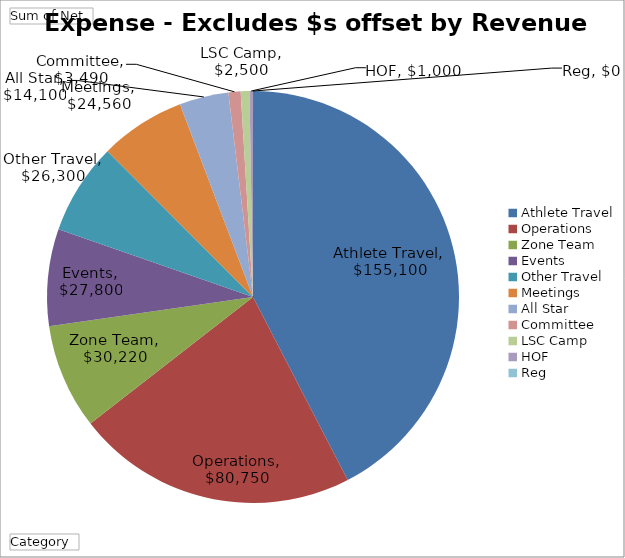
| Category | Total |
|---|---|
| Athlete Travel | 155100 |
| Operations | 80750 |
| Zone Team | 30220 |
| Events | 27800 |
| Other Travel | 26300 |
| Meetings | 24560 |
| All Star | 14100 |
| Committee | 3490 |
| LSC Camp | 2500 |
| HOF | 1000 |
| Reg | 0 |